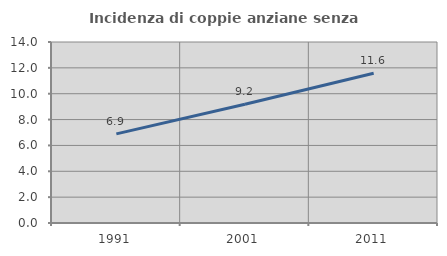
| Category | Incidenza di coppie anziane senza figli  |
|---|---|
| 1991.0 | 6.897 |
| 2001.0 | 9.185 |
| 2011.0 | 11.577 |